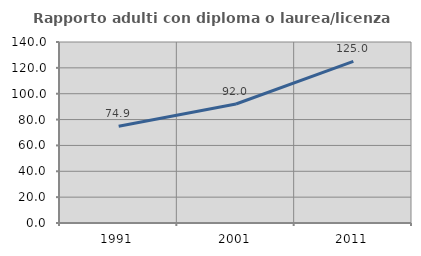
| Category | Rapporto adulti con diploma o laurea/licenza media  |
|---|---|
| 1991.0 | 74.86 |
| 2001.0 | 92.035 |
| 2011.0 | 125 |